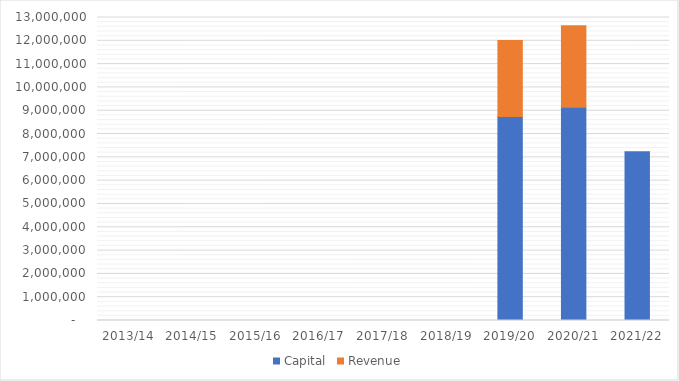
| Category | Capital | Revenue |
|---|---|---|
| 2013/14 | 0 | 0 |
| 2014/15 | 0 | 0 |
| 2015/16 | 0 | 0 |
| 2016/17 | 0 | 0 |
| 2017/18 | 0 | 0 |
| 2018/19 | 0 | 0 |
| 2019/20 | 8751795 | 3264190 |
| 2020/21 | 9145747 | 3501540 |
| 2021/22 | 7241000 | 0 |